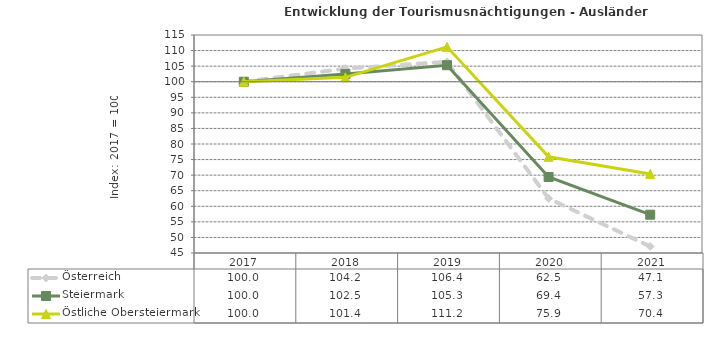
| Category | Österreich | Steiermark | Östliche Obersteiermark |
|---|---|---|---|
| 2021.0 | 47.1 | 57.3 | 70.4 |
| 2020.0 | 62.5 | 69.4 | 75.9 |
| 2019.0 | 106.4 | 105.3 | 111.2 |
| 2018.0 | 104.2 | 102.5 | 101.4 |
| 2017.0 | 100 | 100 | 100 |